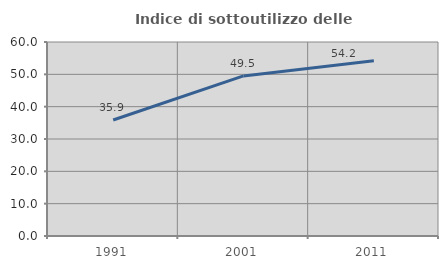
| Category | Indice di sottoutilizzo delle abitazioni  |
|---|---|
| 1991.0 | 35.87 |
| 2001.0 | 49.515 |
| 2011.0 | 54.206 |